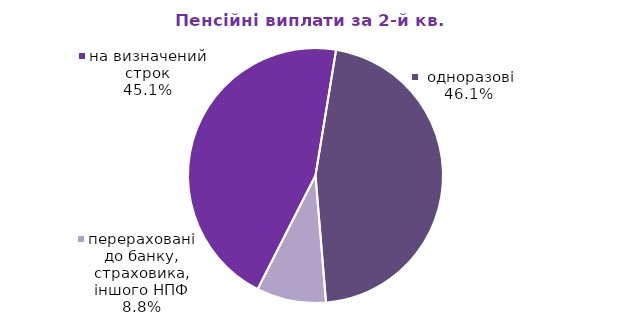
| Category | Series 0 |
|---|---|
| на визначений строк | 12.721 |
|  одноразові | 13.005 |
| перераховані до банку, страховика, іншого НПФ | 2.488 |